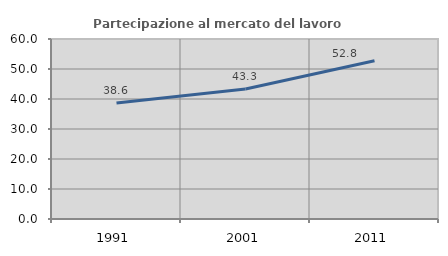
| Category | Partecipazione al mercato del lavoro  femminile |
|---|---|
| 1991.0 | 38.642 |
| 2001.0 | 43.336 |
| 2011.0 | 52.76 |